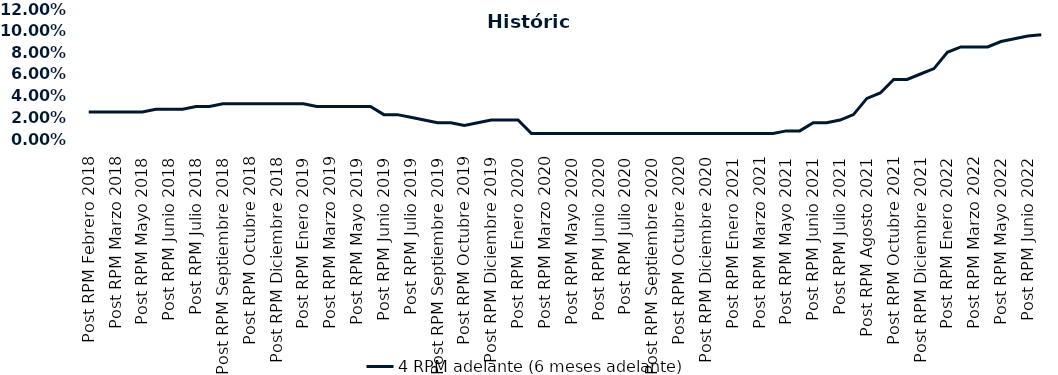
| Category | 4 RPM adelante (6 meses adelante) |
|---|---|
| Post RPM Febrero 2018 | 0.025 |
| Pre RPM Marzo 2018 | 0.025 |
| Post RPM Marzo 2018 | 0.025 |
| Pre RPM Mayo 2018 | 0.025 |
| Post RPM Mayo 2018 | 0.025 |
| Pre RPM Junio 2018 | 0.028 |
| Post RPM Junio 2018 | 0.028 |
| Pre RPM Julio 2018 | 0.028 |
| Post RPM Julio 2018 | 0.03 |
| Pre RPM Septiembre 2018 | 0.03 |
| Post RPM Septiembre 2018 | 0.032 |
| Pre RPM Octubre 2018 | 0.032 |
| Post RPM Octubre 2018 | 0.032 |
| Pre RPM Diciembre 2018 | 0.032 |
| Post RPM Diciembre 2018 | 0.032 |
| Pre RPM Enero 2019 | 0.032 |
| Post RPM Enero 2019 | 0.032 |
| Pre RPM Marzo 2019 | 0.03 |
| Post RPM Marzo 2019 | 0.03 |
| Pre RPM Mayo 2019 | 0.03 |
| Post RPM Mayo 2019 | 0.03 |
| Pre RPM Junio 2019 | 0.03 |
| Post RPM Junio 2019 | 0.022 |
| Pre RPM Julio 2019 | 0.022 |
| Post RPM Julio 2019 | 0.02 |
| Pre RPM Septiembre 2019 | 0.018 |
| Post RPM Septiembre 2019 | 0.015 |
| Pre RPM Octubre 2019 | 0.015 |
| Post RPM Octubre 2019 | 0.012 |
| Pre RPM Diciembre 2019 | 0.015 |
| Post RPM Diciembre 2019 | 0.018 |
| Pre RPM Enero 2020 | 0.018 |
| Post RPM Enero 2020 | 0.018 |
| Pre RPM Marzo 2020 | 0.005 |
| Post RPM Marzo 2020 | 0.005 |
| Pre RPM Mayo 2020 | 0.005 |
| Post RPM Mayo 2020 | 0.005 |
| Pre RPM Junio 2020 | 0.005 |
| Post RPM Junio 2020 | 0.005 |
| Pre RPM Julio 2020 | 0.005 |
| Post RPM Julio 2020 | 0.005 |
| Pre RPM Septiembre 2020 | 0.005 |
| Post RPM Septiembre 2020 | 0.005 |
| Pre RPM Octubre 2020 | 0.005 |
| Post RPM Octubre 2020 | 0.005 |
| Pre RPM Diciembre 2020 | 0.005 |
| Post RPM Diciembre 2020 | 0.005 |
| Pre RPM Enero 2021 | 0.005 |
| Post RPM Enero 2021 | 0.005 |
| Pre RPM Marzo 2021 | 0.005 |
| Post RPM Marzo 2021 | 0.005 |
| Pre RPM Mayo 2021 | 0.005 |
| Post RPM Mayo 2021 | 0.008 |
| Pre RPM Junio 2021 | 0.008 |
| Post RPM Junio 2021 | 0.015 |
| Pre RPM Julio 2021 | 0.015 |
| Post RPM Julio 2021 | 0.018 |
| Pre RPM Agosto 2021 | 0.022 |
| Post RPM Agosto 2021 | 0.038 |
| Pre RPM Octubre 2021 | 0.042 |
| Post RPM Octubre 2021 | 0.055 |
| Pre RPM Diciembre 2021 | 0.055 |
| Post RPM Diciembre 2021 | 0.06 |
| Pre RPM Enero 2022 | 0.065 |
| Post RPM Enero 2022 | 0.08 |
| Pre RPM Marzo 2022 | 0.085 |
| Post RPM Marzo 2022 | 0.085 |
| Pre RPM Mayo 2022 | 0.085 |
| Post RPM Mayo 2022 | 0.09 |
| Pre RPM Junio 2022 | 0.092 |
| Post RPM Junio 2022 | 0.095 |
| Pre RPM Julio 2022 | 0.096 |